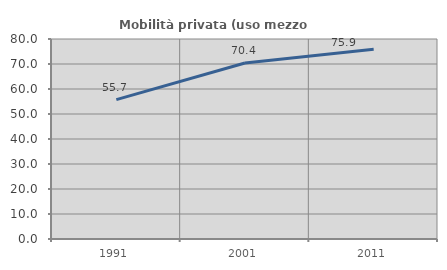
| Category | Mobilità privata (uso mezzo privato) |
|---|---|
| 1991.0 | 55.739 |
| 2001.0 | 70.407 |
| 2011.0 | 75.869 |